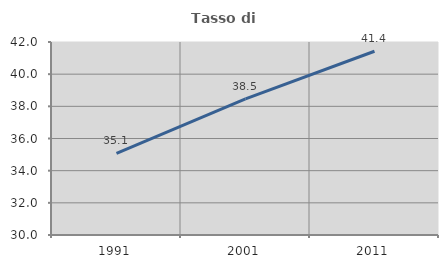
| Category | Tasso di occupazione   |
|---|---|
| 1991.0 | 35.081 |
| 2001.0 | 38.462 |
| 2011.0 | 41.425 |